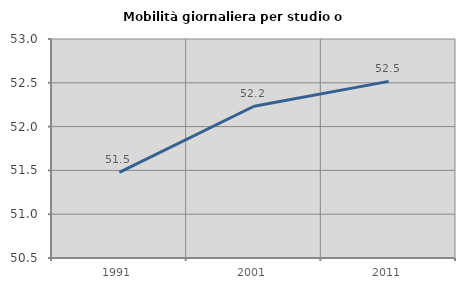
| Category | Mobilità giornaliera per studio o lavoro |
|---|---|
| 1991.0 | 51.478 |
| 2001.0 | 52.232 |
| 2011.0 | 52.516 |